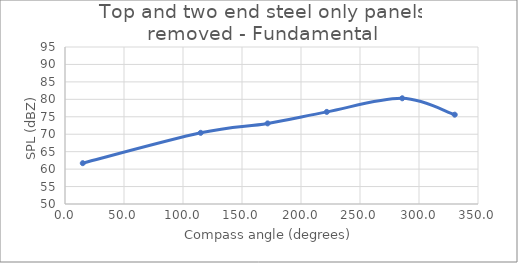
| Category | Series 0 |
|---|---|
| 15.06445125542554 | 61.7 |
| 115.00449447818254 | 70.4 |
| 171.7068171198818 | 73.1 |
| 221.8691292075067 | 76.4 |
| 285.7828166838848 | 80.3 |
| 330.28010595813004 | 75.6 |